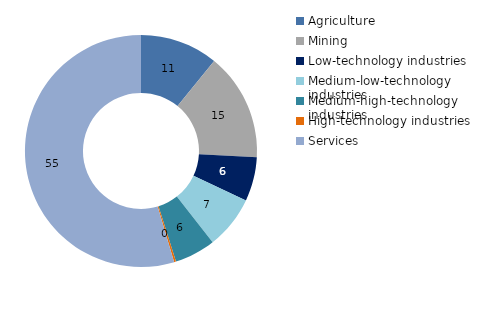
| Category | 2014 |
|---|---|
| Agriculture | 10.857 |
| Mining | 15.003 |
| Low-technology industries | 6.148 |
| Medium-low-technology industries | 7.401 |
| Medium-high-technology industries | 5.715 |
| High-technology industries | 0.261 |
| Services | 54.615 |